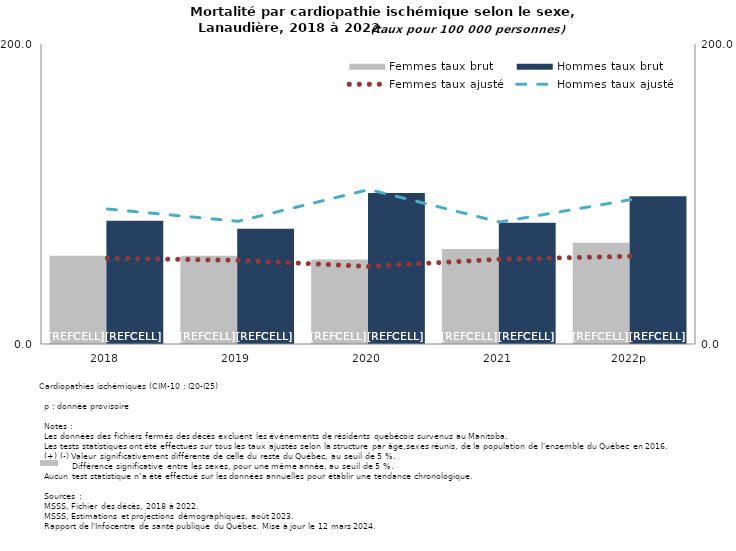
| Category | Femmes taux brut | Hommes taux brut |
|---|---|---|
| 2018 | 58.8 | 82.2 |
| 2019 | 58.8 | 76.9 |
| 2020 | 56.3 | 100.7 |
| 2021 | 63.4 | 80.9 |
| 2022p | 67.5 | 98.5 |